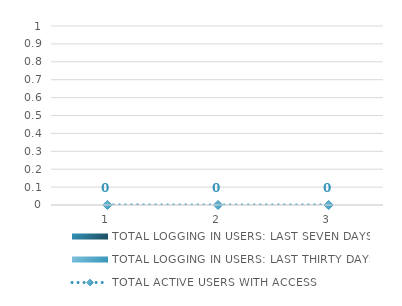
| Category | TOTAL LOGGING IN USERS: LAST SEVEN DAYS | TOTAL LOGGING IN USERS: LAST THIRTY DAYS |
|---|---|---|
| 0 | 0 | 0 |
| 1 | 0 | 0 |
| 2 | 0 | 0 |